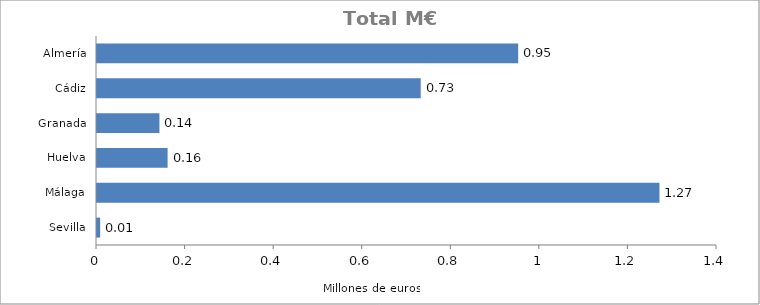
| Category | Total M€ 2013 |
|---|---|
| Almería | 0.951 |
| Cádiz | 0.731 |
| Granada | 0.141 |
| Huelva | 0.159 |
| Málaga | 1.27 |
| Sevilla | 0.007 |